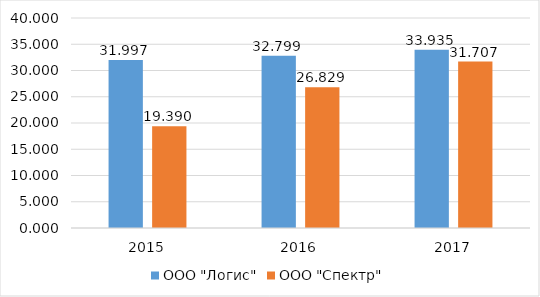
| Category | ООО "Логис" | ООО "Спектр" |
|---|---|---|
| 2015.0 | 31.997 | 19.39 |
| 2016.0 | 32.799 | 26.829 |
| 2017.0 | 33.935 | 31.707 |